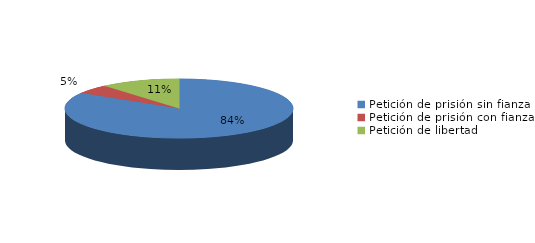
| Category | Series 0 |
|---|---|
| Petición de prisión sin fianza | 67 |
| Petición de prisión con fianza | 4 |
| Petición de libertad | 9 |